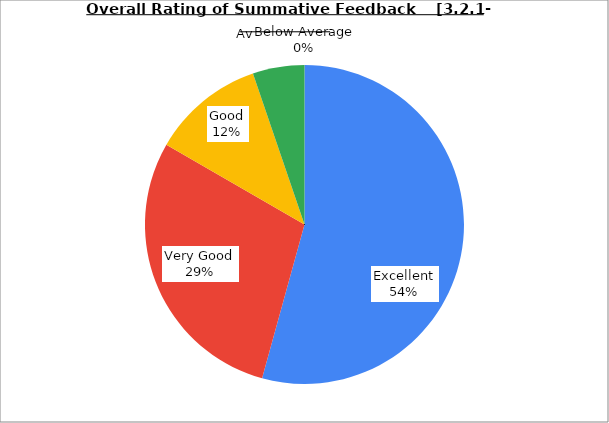
| Category | Series 0 |
|---|---|
| Excellent | 54.286 |
| Very Good | 29.048 |
| Good | 11.429 |
| Average | 5.238 |
| Below Average | 0 |